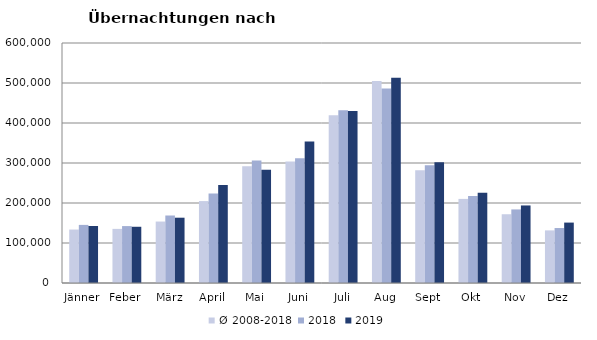
| Category | Ø 2008-2018 | 2018 | 2019 |
|---|---|---|---|
| Jänner | 133615.364 | 145246 | 142561 |
| Feber | 135302.455 | 142295 | 140588 |
| März | 153629 | 168732 | 163253 |
| April | 204805.273 | 224025 | 244826 |
| Mai | 292060 | 306488 | 283418 |
| Juni | 303527.545 | 312160 | 353757 |
| Juli | 419101.455 | 431967 | 430134 |
| Aug | 504986.091 | 486508 | 513292 |
| Sept | 282073.364 | 294404 | 301838 |
| Okt | 210252.364 | 217367 | 225667 |
| Nov | 171903.182 | 183958 | 193867 |
| Dez | 131534.727 | 137414 | 151031 |